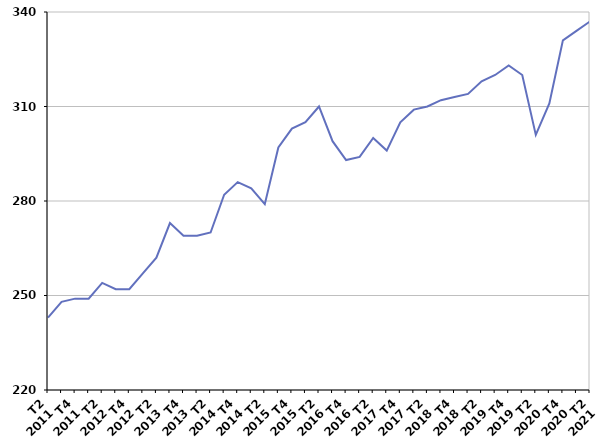
| Category | Durée moyenne d'inscription sur les listes des sortants |
|---|---|
| T2
2011 | 243 |
| T3
2011 | 248 |
| T4
2011 | 249 |
| T1
2012 | 249 |
| T2
2012 | 254 |
| T3
2012 | 252 |
| T4
2012 | 252 |
| T1
2013 | 257 |
| T2
2013 | 262 |
| T3
2013 | 273 |
| T4
2013 | 269 |
| T1
2014 | 269 |
| T2
2014 | 270 |
| T3
2014 | 282 |
| T4
2014 | 286 |
| T1
2015 | 284 |
| T2
2015 | 279 |
| T3
2015 | 297 |
| T4
2015 | 303 |
| T1
2016 | 305 |
| T2
2016 | 310 |
| T3
2016 | 299 |
| T4
2016 | 293 |
| T1
2017 | 294 |
| T2
2017 | 300 |
| T3
2017 | 296 |
| T4
2017 | 305 |
| T1
2018 | 309 |
| T2
2018 | 310 |
| T3
2018 | 312 |
| T4
2018 | 313 |
| T1
2019 | 314 |
| T2
2019 | 318 |
| T3
2019 | 320 |
| T4
2019 | 323 |
| T1
2020 | 320 |
| T2
2020 | 301 |
| T3
2020 | 311 |
| T4
2020 | 331 |
| T1
2021 | 334 |
| T2
2021 | 337 |